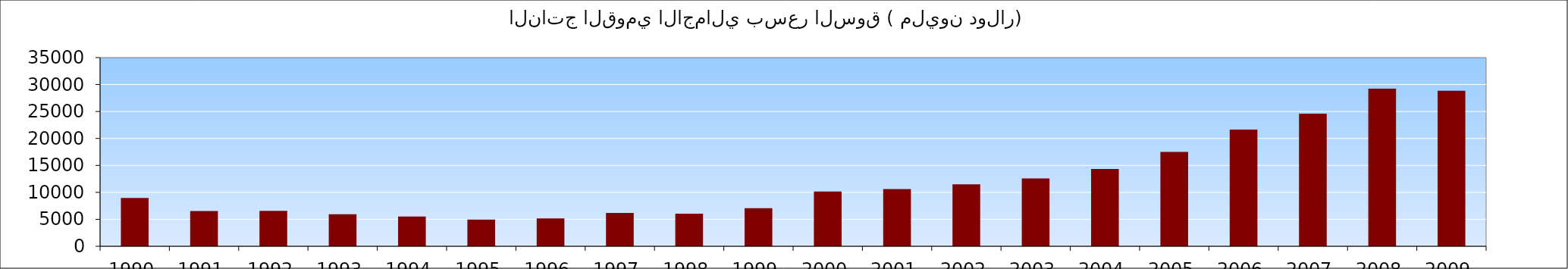
| Category | الناتج القومي الاجمالي بسعر السوق ( مليون دولار) |
|---|---|
| 1990.0 | 8952.73 |
| 1991.0 | 6540.235 |
| 1992.0 | 6575.895 |
| 1993.0 | 5921.927 |
| 1994.0 | 5507.114 |
| 1995.0 | 4941.08 |
| 1996.0 | 5157.867 |
| 1997.0 | 6197.3 |
| 1998.0 | 6037.636 |
| 1999.0 | 7053.175 |
| 2000.0 | 10156.446 |
| 2001.0 | 10612.198 |
| 2002.0 | 11496.218 |
| 2003.0 | 12597.564 |
| 2004.0 | 14341.644 |
| 2005.0 | 17506.02 |
| 2006.0 | 21647.229 |
| 2007.0 | 24581.536 |
| 2008.0 | 29242.482 |
| 2009.0 | 28840.845 |